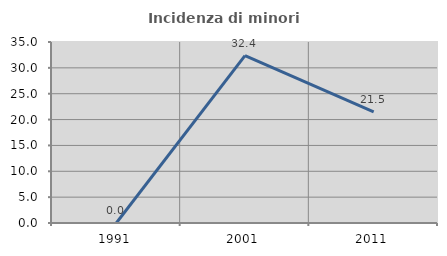
| Category | Incidenza di minori stranieri |
|---|---|
| 1991.0 | 0 |
| 2001.0 | 32.381 |
| 2011.0 | 21.488 |